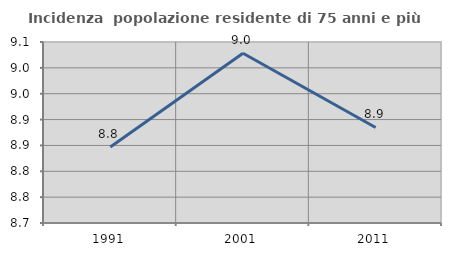
| Category | Incidenza  popolazione residente di 75 anni e più |
|---|---|
| 1991.0 | 8.847 |
| 2001.0 | 9.028 |
| 2011.0 | 8.885 |